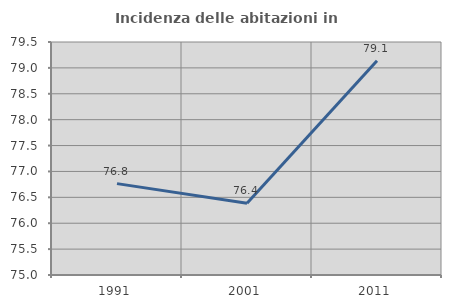
| Category | Incidenza delle abitazioni in proprietà  |
|---|---|
| 1991.0 | 76.765 |
| 2001.0 | 76.386 |
| 2011.0 | 79.137 |